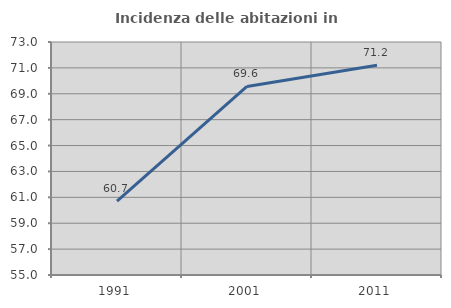
| Category | Incidenza delle abitazioni in proprietà  |
|---|---|
| 1991.0 | 60.698 |
| 2001.0 | 69.567 |
| 2011.0 | 71.212 |